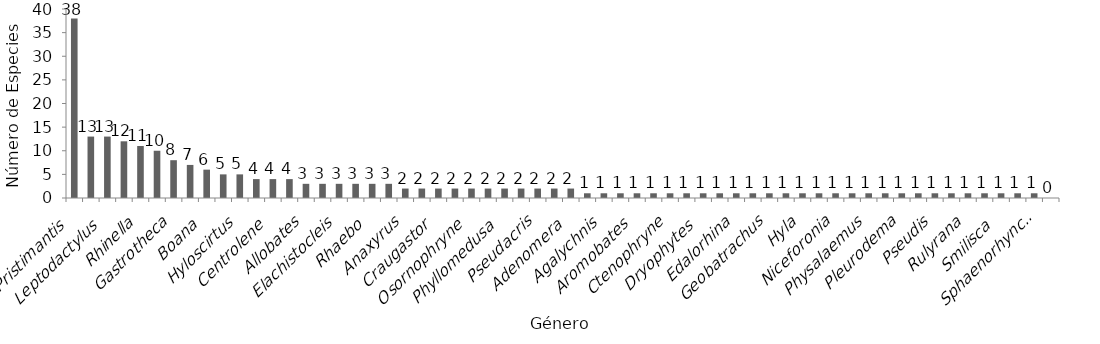
| Category | No. Especies |
|---|---|
| Pristimantis  | 38 |
| Dendropsophus  | 13 |
| Leptodactylus  | 13 |
| Atelopus | 12 |
| Rhinella | 11 |
| Hyloxalus | 10 |
| Gastrotheca | 8 |
| Scinax | 7 |
| Boana  | 6 |
| Colostethus | 5 |
| Hyloscirtus | 5 |
| Ameerega | 4 |
| Centrolene  | 4 |
| Lithobates | 4 |
| Allobates | 3 |
| Andinobates  | 3 |
| Elachistocleis | 3 |
| Phyllobates  | 3 |
| Rhaebo  | 3 |
| Strabomantis | 3 |
| Anaxyrus | 2 |
| Ceratophrys | 2 |
| Craugastor  | 2 |
| Espadarana | 2 |
| Osornophryne  | 2 |
| Osteocephalus | 2 |
| Phyllomedusa  | 2 |
| Pipa | 2 |
| Pseudacris | 2 |
| Sachatamia  | 2 |
| Adenomera  | 2 |
| Acris | 1 |
| Agalychnis | 1 |
| Anomaloglossus | 1 |
| Aromobates  | 1 |
| Cryptobatrachus | 1 |
| Ctenophryne | 1 |
| Dendrobates | 1 |
| Dryophytes  | 1 |
| Ecnomiohyla | 1 |
| Edalorhina | 1 |
| Engystomops | 1 |
| Geobatrachus | 1 |
| Hyalinobatrachium | 1 |
| Hyla | 1 |
| Lithodytes  | 1 |
| Niceforonia | 1 |
| Oophaga | 1 |
| Physalaemus | 1 |
| Pithecopus  | 1 |
| Pleurodema | 1 |
| Pseudopaludicola | 1 |
| Pseudis | 1 |
| Rheobates  | 1 |
| Rulyrana | 1 |
| Scarthyla  | 1 |
| Smilisca  | 1 |
| Trachycephalus | 1 |
| Sphaenorhynchus | 1 |
| Minyobates | 0 |